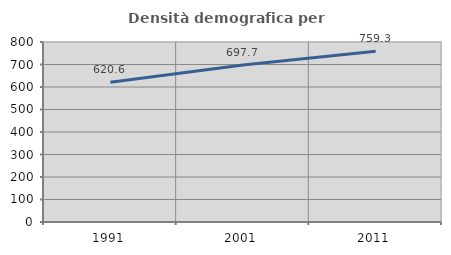
| Category | Densità demografica |
|---|---|
| 1991.0 | 620.639 |
| 2001.0 | 697.727 |
| 2011.0 | 759.257 |